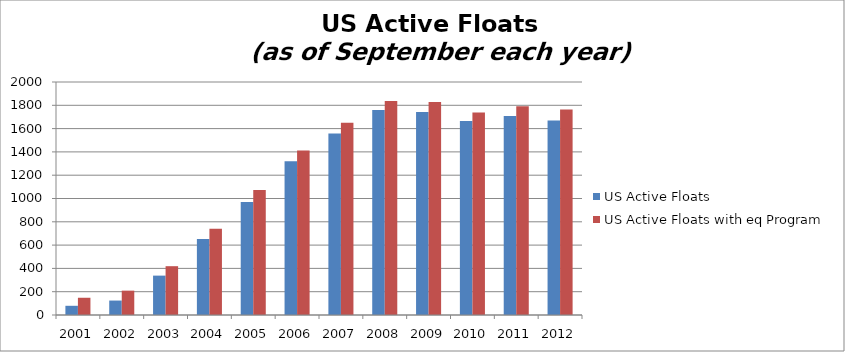
| Category | US Active Floats | US Active Floats with eq Program |
|---|---|---|
| 2001.0 | 79 | 148 |
| 2002.0 | 124 | 209 |
| 2003.0 | 338 | 419 |
| 2004.0 | 653 | 741 |
| 2005.0 | 971 | 1072 |
| 2006.0 | 1319 | 1412 |
| 2007.0 | 1557 | 1650 |
| 2008.0 | 1759 | 1837 |
| 2009.0 | 1742 | 1829 |
| 2010.0 | 1666 | 1739 |
| 2011.0 | 1709 | 1791 |
| 2012.0 | 1669 | 1764 |